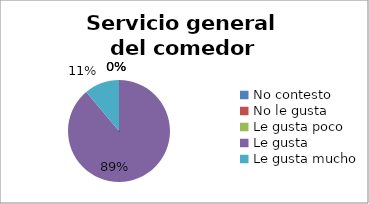
| Category | Series 0 |
|---|---|
| No contesto | 0 |
| No le gusta | 0 |
| Le gusta poco | 0 |
| Le gusta | 8 |
| Le gusta mucho | 1 |